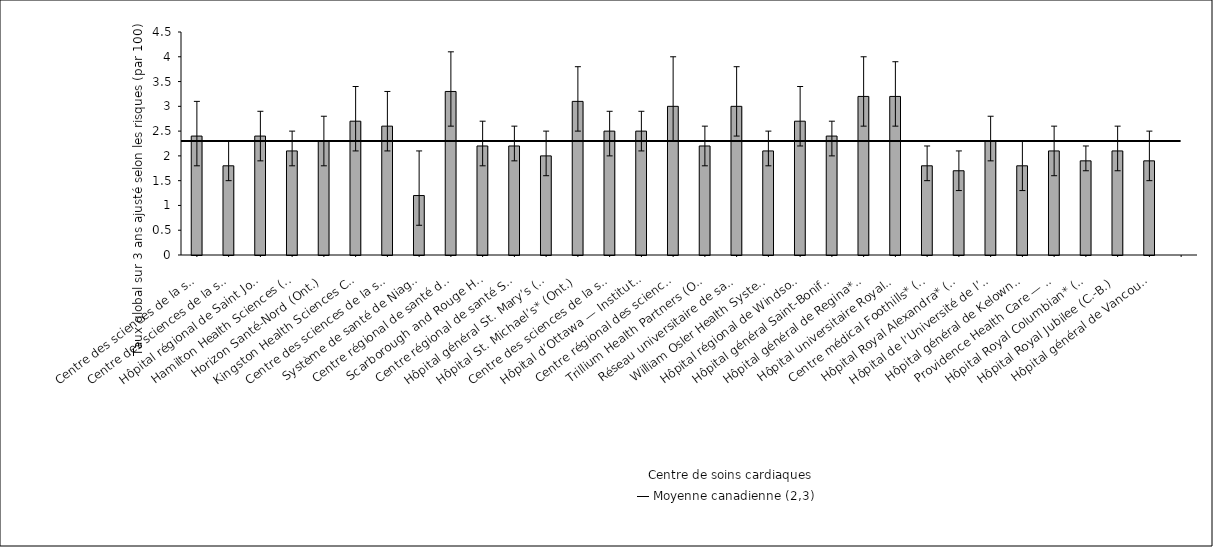
| Category | Taux 
ajusté selon 
les risques |
|---|---|
| Centre des sciences de la santé — St. John’s (T. -N.-L.) | 2.4 |
| Centre des sciences de la santé Queen Elizabeth II (N.-É.) | 1.8 |
| Hôpital régional de Saint John (N.-B.) | 2.4 |
| Hamilton Health Sciences (Ont.) | 2.1 |
| Horizon Santé-Nord (Ont.) | 2.3 |
| Kingston Health Sciences Centre (Ont.) | 2.7 |
| Centre des sciences de la santé de London (Ont.) | 2.6 |
| Système de santé de Niagara* (Ont.) | 1.2 |
| Centre régional de santé de Peterborough* (Ont.) | 3.3 |
| Scarborough and Rouge Hospital (Ont.) | 2.2 |
| Centre régional de santé Southlake (Ont.) | 2.2 |
| Hôpital général St. Mary’s (Ont.) | 2 |
| Hôpital St. Michael’s* (Ont.) | 3.1 |
| Centre des sciences de la santé Sunnybrook (Ont.) | 2.5 |
| Hôpital d’Ottawa — Institut de cardiologie de l’Université d’Ottawa (Ont.) | 2.5 |
| Centre régional des sciences de la santé de Thunder Bay (Ont.) | 3 |
| Trillium Health Partners (Ont.) | 2.2 |
| Réseau universitaire de santé* (Ont.) | 3 |
| William Osler Health System (Ont.) | 2.1 |
| Hôpital régional de Windsor (Ont.) | 2.7 |
| Hôpital général Saint-Boniface (Man.) | 2.4 |
| Hôpital général de Regina* (Sask.) | 3.2 |
| Hôpital universitaire Royal* (Sask.) | 3.2 |
| Centre médical Foothills* (Alb.) | 1.8 |
| Hôpital Royal Alexandra* (Alb.) | 1.7 |
| Hôpital de l’Université de l’Alberta (Alb.) | 2.3 |
| Hôpital général de Kelowna (C.-B.) | 1.8 |
| Providence Health Care — Hôpital St. Paul’s (Vancouver) (C.-B.) | 2.1 |
| Hôpital Royal Columbian* (C.-B.) | 1.9 |
| Hôpital Royal Jubilee (C.-B.) | 2.1 |
| Hôpital général de Vancouver (C.-B.) | 1.9 |